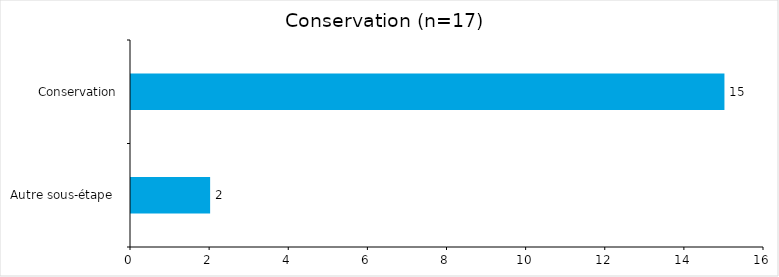
| Category | Series 0 |
|---|---|
| Autre sous-étape  | 2 |
| Conservation | 15 |